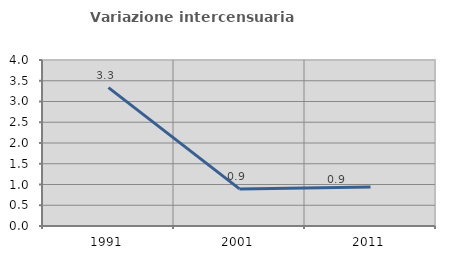
| Category | Variazione intercensuaria annua |
|---|---|
| 1991.0 | 3.336 |
| 2001.0 | 0.894 |
| 2011.0 | 0.941 |